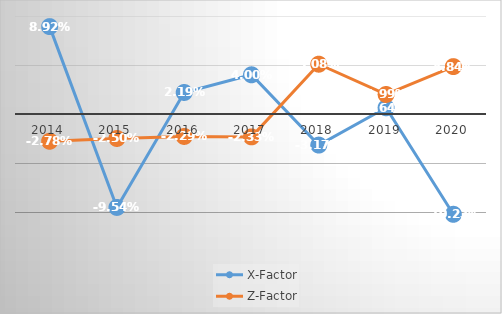
| Category | X-Factor | Z-Factor  |
|---|---|---|
| 2014.0 | 0.089 | -0.028 |
| 2015.0 | -0.095 | -0.025 |
| 2016.0 | 0.022 | -0.023 |
| 2017.0 | 0.04 | -0.023 |
| 2018.0 | -0.032 | 0.051 |
| 2019.0 | 0.006 | 0.02 |
| 2020.0 | -0.102 | 0.048 |